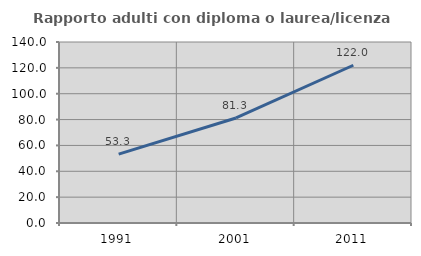
| Category | Rapporto adulti con diploma o laurea/licenza media  |
|---|---|
| 1991.0 | 53.275 |
| 2001.0 | 81.25 |
| 2011.0 | 122.021 |